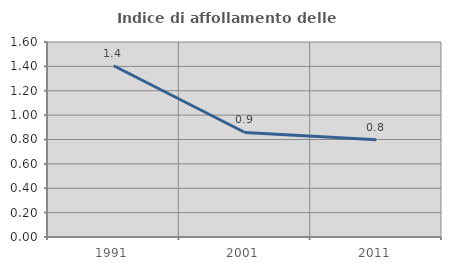
| Category | Indice di affollamento delle abitazioni  |
|---|---|
| 1991.0 | 1.405 |
| 2001.0 | 0.857 |
| 2011.0 | 0.797 |